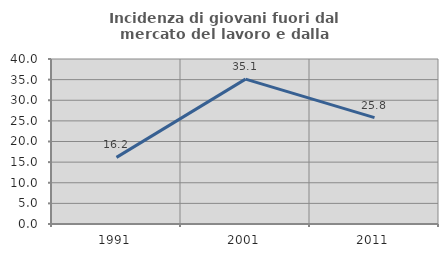
| Category | Incidenza di giovani fuori dal mercato del lavoro e dalla formazione  |
|---|---|
| 1991.0 | 16.152 |
| 2001.0 | 35.129 |
| 2011.0 | 25.78 |